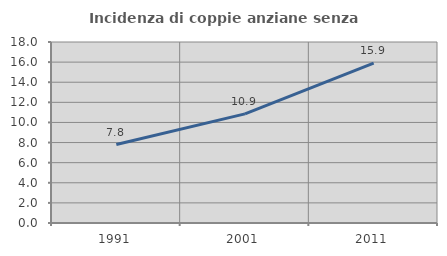
| Category | Incidenza di coppie anziane senza figli  |
|---|---|
| 1991.0 | 7.805 |
| 2001.0 | 10.853 |
| 2011.0 | 15.9 |